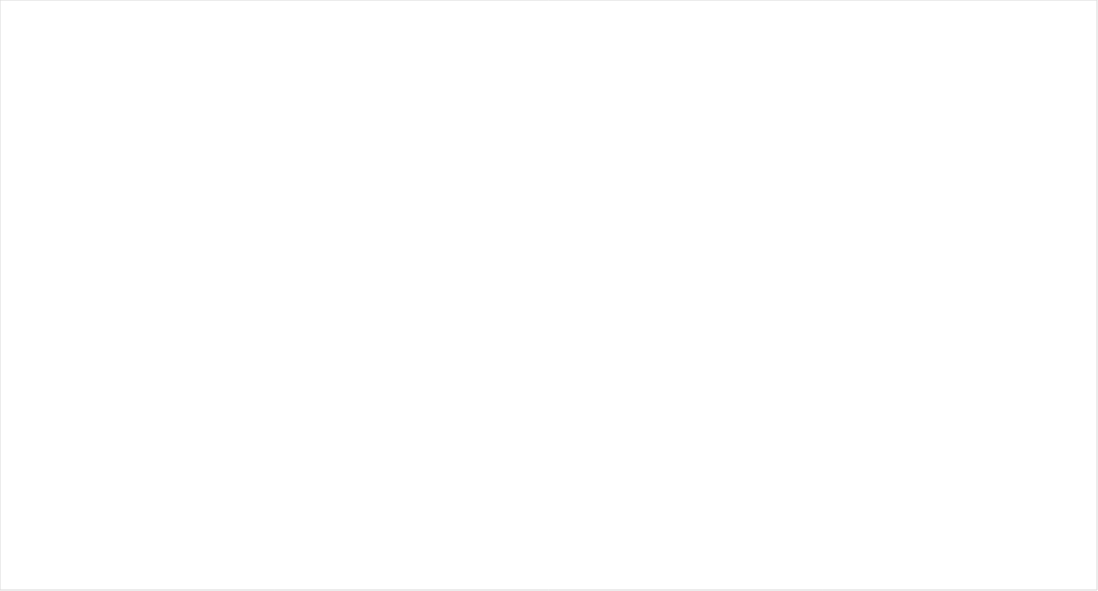
| Category | Total |
|---|---|
| GRPFM–1 | 1 |
| GRPFM–2 | 1 |
| GRPFM–3 | 2 |
| GRPFM–4 | 3 |
| GRPFM–5 | 1 |
| GRPFM–6 | 2 |
| GRPFM–7 | 1 |
| GRPFM–8 | 1 |
| GRPFM–9 | 1 |